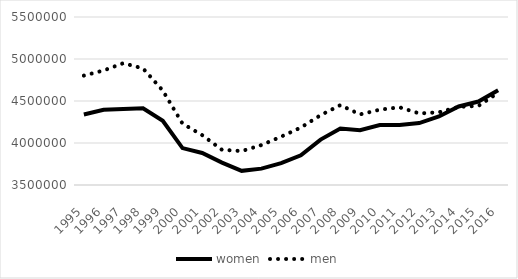
| Category | women | men |
|---|---|---|
| 1995-01-01 | 4338648 | 4802353 |
| 1996-01-01 | 4395085 | 4863055 |
| 1997-01-01 | 4405197 | 4950171 |
| 1998-01-01 | 4412652 | 4888015 |
| 1999-01-01 | 4264794 | 4624110 |
| 2000-01-01 | 3939310 | 4231437 |
| 2001-01-01 | 3881431 | 4093175 |
| 2002-01-01 | 3766227 | 3919297 |
| 2003-01-01 | 3668437 | 3903826 |
| 2004-01-01 | 3694880 | 3975287 |
| 2005-01-01 | 3759921 | 4075837 |
| 2006-01-01 | 3854173 | 4183972 |
| 2007-01-01 | 4040822 | 4331347 |
| 2008-01-01 | 4173499 | 4450690 |
| 2009-01-01 | 4152225 | 4340363 |
| 2010-01-01 | 4214560 | 4396807 |
| 2011-01-01 | 4215127 | 4425329 |
| 2012-01-01 | 4237809 | 4351970 |
| 2013-01-01 | 4316197 | 4365680 |
| 2014-01-01 | 4434573 | 4429842 |
| 2015-01-01 | 4493490 | 4441612 |
| 2016-01-01 | 4627345 | 4597706 |